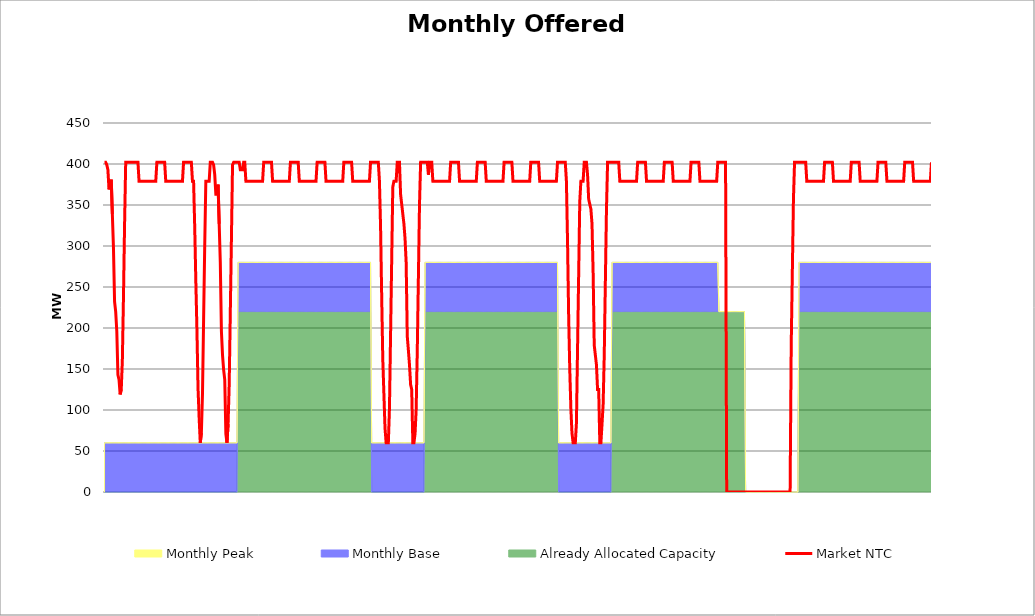
| Category | Market NTC |
|---|---|
| 0 | 402 |
| 1 | 402 |
| 2 | 399 |
| 3 | 393 |
| 4 | 369 |
| 5 | 375 |
| 6 | 381 |
| 7 | 339 |
| 8 | 298 |
| 9 | 232 |
| 10 | 220 |
| 11 | 196 |
| 12 | 143 |
| 13 | 137 |
| 14 | 119 |
| 15 | 125 |
| 16 | 161 |
| 17 | 238 |
| 18 | 327 |
| 19 | 402 |
| 20 | 402 |
| 21 | 402 |
| 22 | 402 |
| 23 | 402 |
| 24 | 402 |
| 25 | 402 |
| 26 | 402 |
| 27 | 402 |
| 28 | 402 |
| 29 | 402 |
| 30 | 402 |
| 31 | 379 |
| 32 | 379 |
| 33 | 379 |
| 34 | 379 |
| 35 | 379 |
| 36 | 379 |
| 37 | 379 |
| 38 | 379 |
| 39 | 379 |
| 40 | 379 |
| 41 | 379 |
| 42 | 379 |
| 43 | 379 |
| 44 | 379 |
| 45 | 379 |
| 46 | 379 |
| 47 | 402 |
| 48 | 402 |
| 49 | 402 |
| 50 | 402 |
| 51 | 402 |
| 52 | 402 |
| 53 | 402 |
| 54 | 402 |
| 55 | 379 |
| 56 | 379 |
| 57 | 379 |
| 58 | 379 |
| 59 | 379 |
| 60 | 379 |
| 61 | 379 |
| 62 | 379 |
| 63 | 379 |
| 64 | 379 |
| 65 | 379 |
| 66 | 379 |
| 67 | 379 |
| 68 | 379 |
| 69 | 379 |
| 70 | 379 |
| 71 | 402 |
| 72 | 402 |
| 73 | 402 |
| 74 | 402 |
| 75 | 402 |
| 76 | 402 |
| 77 | 402 |
| 78 | 402 |
| 79 | 379 |
| 80 | 379 |
| 81 | 324 |
| 82 | 258 |
| 83 | 198 |
| 84 | 126 |
| 85 | 90 |
| 86 | 60 |
| 87 | 72 |
| 88 | 120 |
| 89 | 210 |
| 90 | 300 |
| 91 | 379 |
| 92 | 379 |
| 93 | 379 |
| 94 | 379 |
| 95 | 402 |
| 96 | 402 |
| 97 | 402 |
| 98 | 399 |
| 99 | 387 |
| 100 | 363 |
| 101 | 363 |
| 102 | 375 |
| 103 | 327 |
| 104 | 280 |
| 105 | 196 |
| 106 | 167 |
| 107 | 149 |
| 108 | 137 |
| 109 | 71 |
| 110 | 60 |
| 111 | 83 |
| 112 | 131 |
| 113 | 220 |
| 114 | 309 |
| 115 | 399 |
| 116 | 402 |
| 117 | 402 |
| 118 | 402 |
| 119 | 402 |
| 120 | 402 |
| 121 | 402 |
| 122 | 393 |
| 123 | 393 |
| 124 | 393 |
| 125 | 402 |
| 126 | 402 |
| 127 | 379 |
| 128 | 379 |
| 129 | 379 |
| 130 | 379 |
| 131 | 379 |
| 132 | 379 |
| 133 | 379 |
| 134 | 379 |
| 135 | 379 |
| 136 | 379 |
| 137 | 379 |
| 138 | 379 |
| 139 | 379 |
| 140 | 379 |
| 141 | 379 |
| 142 | 379 |
| 143 | 402 |
| 144 | 402 |
| 145 | 402 |
| 146 | 402 |
| 147 | 402 |
| 148 | 402 |
| 149 | 402 |
| 150 | 402 |
| 151 | 379 |
| 152 | 379 |
| 153 | 379 |
| 154 | 379 |
| 155 | 379 |
| 156 | 379 |
| 157 | 379 |
| 158 | 379 |
| 159 | 379 |
| 160 | 379 |
| 161 | 379 |
| 162 | 379 |
| 163 | 379 |
| 164 | 379 |
| 165 | 379 |
| 166 | 379 |
| 167 | 402 |
| 168 | 402 |
| 169 | 402 |
| 170 | 402 |
| 171 | 402 |
| 172 | 402 |
| 173 | 402 |
| 174 | 402 |
| 175 | 379 |
| 176 | 379 |
| 177 | 379 |
| 178 | 379 |
| 179 | 379 |
| 180 | 379 |
| 181 | 379 |
| 182 | 379 |
| 183 | 379 |
| 184 | 379 |
| 185 | 379 |
| 186 | 379 |
| 187 | 379 |
| 188 | 379 |
| 189 | 379 |
| 190 | 379 |
| 191 | 402 |
| 192 | 402 |
| 193 | 402 |
| 194 | 402 |
| 195 | 402 |
| 196 | 402 |
| 197 | 402 |
| 198 | 402 |
| 199 | 379 |
| 200 | 379 |
| 201 | 379 |
| 202 | 379 |
| 203 | 379 |
| 204 | 379 |
| 205 | 379 |
| 206 | 379 |
| 207 | 379 |
| 208 | 379 |
| 209 | 379 |
| 210 | 379 |
| 211 | 379 |
| 212 | 379 |
| 213 | 379 |
| 214 | 379 |
| 215 | 402 |
| 216 | 402 |
| 217 | 402 |
| 218 | 402 |
| 219 | 402 |
| 220 | 402 |
| 221 | 402 |
| 222 | 402 |
| 223 | 379 |
| 224 | 379 |
| 225 | 379 |
| 226 | 379 |
| 227 | 379 |
| 228 | 379 |
| 229 | 379 |
| 230 | 379 |
| 231 | 379 |
| 232 | 379 |
| 233 | 379 |
| 234 | 379 |
| 235 | 379 |
| 236 | 379 |
| 237 | 379 |
| 238 | 379 |
| 239 | 402 |
| 240 | 402 |
| 241 | 402 |
| 242 | 402 |
| 243 | 402 |
| 244 | 402 |
| 245 | 402 |
| 246 | 402 |
| 247 | 379 |
| 248 | 324 |
| 249 | 240 |
| 250 | 162 |
| 251 | 120 |
| 252 | 78 |
| 253 | 60 |
| 254 | 60 |
| 255 | 60 |
| 256 | 102 |
| 257 | 192 |
| 258 | 282 |
| 259 | 372 |
| 260 | 379 |
| 261 | 379 |
| 262 | 379 |
| 263 | 402 |
| 264 | 402 |
| 265 | 402 |
| 266 | 363 |
| 267 | 351 |
| 268 | 339 |
| 269 | 327 |
| 270 | 309 |
| 271 | 280 |
| 272 | 190 |
| 273 | 173 |
| 274 | 155 |
| 275 | 131 |
| 276 | 125 |
| 277 | 60 |
| 278 | 60 |
| 279 | 71 |
| 280 | 101 |
| 281 | 173 |
| 282 | 262 |
| 283 | 351 |
| 284 | 402 |
| 285 | 402 |
| 286 | 402 |
| 287 | 402 |
| 288 | 402 |
| 289 | 402 |
| 290 | 402 |
| 291 | 387 |
| 292 | 402 |
| 293 | 402 |
| 294 | 402 |
| 295 | 379 |
| 296 | 379 |
| 297 | 379 |
| 298 | 379 |
| 299 | 379 |
| 300 | 379 |
| 301 | 379 |
| 302 | 379 |
| 303 | 379 |
| 304 | 379 |
| 305 | 379 |
| 306 | 379 |
| 307 | 379 |
| 308 | 379 |
| 309 | 379 |
| 310 | 379 |
| 311 | 402 |
| 312 | 402 |
| 313 | 402 |
| 314 | 402 |
| 315 | 402 |
| 316 | 402 |
| 317 | 402 |
| 318 | 402 |
| 319 | 379 |
| 320 | 379 |
| 321 | 379 |
| 322 | 379 |
| 323 | 379 |
| 324 | 379 |
| 325 | 379 |
| 326 | 379 |
| 327 | 379 |
| 328 | 379 |
| 329 | 379 |
| 330 | 379 |
| 331 | 379 |
| 332 | 379 |
| 333 | 379 |
| 334 | 379 |
| 335 | 402 |
| 336 | 402 |
| 337 | 402 |
| 338 | 402 |
| 339 | 402 |
| 340 | 402 |
| 341 | 402 |
| 342 | 402 |
| 343 | 379 |
| 344 | 379 |
| 345 | 379 |
| 346 | 379 |
| 347 | 379 |
| 348 | 379 |
| 349 | 379 |
| 350 | 379 |
| 351 | 379 |
| 352 | 379 |
| 353 | 379 |
| 354 | 379 |
| 355 | 379 |
| 356 | 379 |
| 357 | 379 |
| 358 | 379 |
| 359 | 402 |
| 360 | 402 |
| 361 | 402 |
| 362 | 402 |
| 363 | 402 |
| 364 | 402 |
| 365 | 402 |
| 366 | 402 |
| 367 | 379 |
| 368 | 379 |
| 369 | 379 |
| 370 | 379 |
| 371 | 379 |
| 372 | 379 |
| 373 | 379 |
| 374 | 379 |
| 375 | 379 |
| 376 | 379 |
| 377 | 379 |
| 378 | 379 |
| 379 | 379 |
| 380 | 379 |
| 381 | 379 |
| 382 | 379 |
| 383 | 402 |
| 384 | 402 |
| 385 | 402 |
| 386 | 402 |
| 387 | 402 |
| 388 | 402 |
| 389 | 402 |
| 390 | 402 |
| 391 | 379 |
| 392 | 379 |
| 393 | 379 |
| 394 | 379 |
| 395 | 379 |
| 396 | 379 |
| 397 | 379 |
| 398 | 379 |
| 399 | 379 |
| 400 | 379 |
| 401 | 379 |
| 402 | 379 |
| 403 | 379 |
| 404 | 379 |
| 405 | 379 |
| 406 | 379 |
| 407 | 402 |
| 408 | 402 |
| 409 | 402 |
| 410 | 402 |
| 411 | 402 |
| 412 | 402 |
| 413 | 402 |
| 414 | 402 |
| 415 | 379 |
| 416 | 306 |
| 417 | 216 |
| 418 | 150 |
| 419 | 102 |
| 420 | 72 |
| 421 | 60 |
| 422 | 60 |
| 423 | 60 |
| 424 | 84 |
| 425 | 174 |
| 426 | 264 |
| 427 | 354 |
| 428 | 379 |
| 429 | 379 |
| 430 | 379 |
| 431 | 402 |
| 432 | 402 |
| 433 | 402 |
| 434 | 387 |
| 435 | 357 |
| 436 | 351 |
| 437 | 345 |
| 438 | 327 |
| 439 | 268 |
| 440 | 179 |
| 441 | 167 |
| 442 | 155 |
| 443 | 125 |
| 444 | 125 |
| 445 | 60 |
| 446 | 60 |
| 447 | 83 |
| 448 | 107 |
| 449 | 167 |
| 450 | 256 |
| 451 | 345 |
| 452 | 402 |
| 453 | 402 |
| 454 | 402 |
| 455 | 402 |
| 456 | 402 |
| 457 | 402 |
| 458 | 402 |
| 459 | 402 |
| 460 | 402 |
| 461 | 402 |
| 462 | 402 |
| 463 | 379 |
| 464 | 379 |
| 465 | 379 |
| 466 | 379 |
| 467 | 379 |
| 468 | 379 |
| 469 | 379 |
| 470 | 379 |
| 471 | 379 |
| 472 | 379 |
| 473 | 379 |
| 474 | 379 |
| 475 | 379 |
| 476 | 379 |
| 477 | 379 |
| 478 | 379 |
| 479 | 402 |
| 480 | 402 |
| 481 | 402 |
| 482 | 402 |
| 483 | 402 |
| 484 | 402 |
| 485 | 402 |
| 486 | 402 |
| 487 | 379 |
| 488 | 379 |
| 489 | 379 |
| 490 | 379 |
| 491 | 379 |
| 492 | 379 |
| 493 | 379 |
| 494 | 379 |
| 495 | 379 |
| 496 | 379 |
| 497 | 379 |
| 498 | 379 |
| 499 | 379 |
| 500 | 379 |
| 501 | 379 |
| 502 | 379 |
| 503 | 402 |
| 504 | 402 |
| 505 | 402 |
| 506 | 402 |
| 507 | 402 |
| 508 | 402 |
| 509 | 402 |
| 510 | 402 |
| 511 | 379 |
| 512 | 379 |
| 513 | 379 |
| 514 | 379 |
| 515 | 379 |
| 516 | 379 |
| 517 | 379 |
| 518 | 379 |
| 519 | 379 |
| 520 | 379 |
| 521 | 379 |
| 522 | 379 |
| 523 | 379 |
| 524 | 379 |
| 525 | 379 |
| 526 | 379 |
| 527 | 402 |
| 528 | 402 |
| 529 | 402 |
| 530 | 402 |
| 531 | 402 |
| 532 | 402 |
| 533 | 402 |
| 534 | 402 |
| 535 | 379 |
| 536 | 379 |
| 537 | 379 |
| 538 | 379 |
| 539 | 379 |
| 540 | 379 |
| 541 | 379 |
| 542 | 379 |
| 543 | 379 |
| 544 | 379 |
| 545 | 379 |
| 546 | 379 |
| 547 | 379 |
| 548 | 379 |
| 549 | 379 |
| 550 | 379 |
| 551 | 402 |
| 552 | 402 |
| 553 | 402 |
| 554 | 402 |
| 555 | 402 |
| 556 | 402 |
| 557 | 402 |
| 558 | 402 |
| 559 | 0 |
| 560 | 0 |
| 561 | 0 |
| 562 | 0 |
| 563 | 0 |
| 564 | 0 |
| 565 | 0 |
| 566 | 0 |
| 567 | 0 |
| 568 | 0 |
| 569 | 0 |
| 570 | 0 |
| 571 | 0 |
| 572 | 0 |
| 573 | 0 |
| 574 | 0 |
| 575 | 0 |
| 576 | 0 |
| 577 | 0 |
| 578 | 0 |
| 579 | 0 |
| 580 | 0 |
| 581 | 0 |
| 582 | 0 |
| 583 | 0 |
| 584 | 0 |
| 585 | 0 |
| 586 | 0 |
| 587 | 0 |
| 588 | 0 |
| 589 | 0 |
| 590 | 0 |
| 591 | 0 |
| 592 | 0 |
| 593 | 0 |
| 594 | 0 |
| 595 | 0 |
| 596 | 0 |
| 597 | 0 |
| 598 | 0 |
| 599 | 0 |
| 600 | 0 |
| 601 | 0 |
| 602 | 0 |
| 603 | 0 |
| 604 | 0 |
| 605 | 0 |
| 606 | 0 |
| 607 | 0 |
| 608 | 0 |
| 609 | 0 |
| 610 | 0 |
| 611 | 0 |
| 612 | 0 |
| 613 | 0 |
| 614 | 0 |
| 615 | 0 |
| 616 | 0 |
| 617 | 179 |
| 618 | 268 |
| 619 | 357 |
| 620 | 402 |
| 621 | 402 |
| 622 | 402 |
| 623 | 402 |
| 624 | 402 |
| 625 | 402 |
| 626 | 402 |
| 627 | 402 |
| 628 | 402 |
| 629 | 402 |
| 630 | 402 |
| 631 | 379 |
| 632 | 379 |
| 633 | 379 |
| 634 | 379 |
| 635 | 379 |
| 636 | 379 |
| 637 | 379 |
| 638 | 379 |
| 639 | 379 |
| 640 | 379 |
| 641 | 379 |
| 642 | 379 |
| 643 | 379 |
| 644 | 379 |
| 645 | 379 |
| 646 | 379 |
| 647 | 402 |
| 648 | 402 |
| 649 | 402 |
| 650 | 402 |
| 651 | 402 |
| 652 | 402 |
| 653 | 402 |
| 654 | 402 |
| 655 | 379 |
| 656 | 379 |
| 657 | 379 |
| 658 | 379 |
| 659 | 379 |
| 660 | 379 |
| 661 | 379 |
| 662 | 379 |
| 663 | 379 |
| 664 | 379 |
| 665 | 379 |
| 666 | 379 |
| 667 | 379 |
| 668 | 379 |
| 669 | 379 |
| 670 | 379 |
| 671 | 402 |
| 672 | 402 |
| 673 | 402 |
| 674 | 402 |
| 675 | 402 |
| 676 | 402 |
| 677 | 402 |
| 678 | 402 |
| 679 | 379 |
| 680 | 379 |
| 681 | 379 |
| 682 | 379 |
| 683 | 379 |
| 684 | 379 |
| 685 | 379 |
| 686 | 379 |
| 687 | 379 |
| 688 | 379 |
| 689 | 379 |
| 690 | 379 |
| 691 | 379 |
| 692 | 379 |
| 693 | 379 |
| 694 | 379 |
| 695 | 402 |
| 696 | 402 |
| 697 | 402 |
| 698 | 402 |
| 699 | 402 |
| 700 | 402 |
| 701 | 402 |
| 702 | 402 |
| 703 | 379 |
| 704 | 379 |
| 705 | 379 |
| 706 | 379 |
| 707 | 379 |
| 708 | 379 |
| 709 | 379 |
| 710 | 379 |
| 711 | 379 |
| 712 | 379 |
| 713 | 379 |
| 714 | 379 |
| 715 | 379 |
| 716 | 379 |
| 717 | 379 |
| 718 | 379 |
| 719 | 402 |
| 720 | 402 |
| 721 | 402 |
| 722 | 402 |
| 723 | 402 |
| 724 | 402 |
| 725 | 402 |
| 726 | 402 |
| 727 | 379 |
| 728 | 379 |
| 729 | 379 |
| 730 | 379 |
| 731 | 379 |
| 732 | 379 |
| 733 | 379 |
| 734 | 379 |
| 735 | 379 |
| 736 | 379 |
| 737 | 379 |
| 738 | 379 |
| 739 | 379 |
| 740 | 379 |
| 741 | 379 |
| 742 | 379 |
| 743 | 402 |